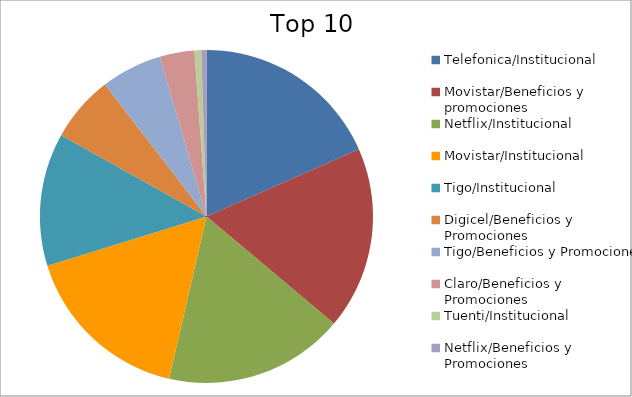
| Category | Series 0 |
|---|---|
| Telefonica/Institucional | 17.87 |
| Movistar/Beneficios y promociones | 17.22 |
| Netflix/Institucional | 16.99 |
| Movistar/Institucional | 16.15 |
| Tigo/Institucional | 12.52 |
| Digicel/Beneficios y Promociones | 6.25 |
| Tigo/Beneficios y Promociones | 5.76 |
| Claro/Beneficios y Promociones | 3.26 |
| Tuenti/Institucional | 0.64 |
| Netflix/Beneficios y Promociones | 0.49 |